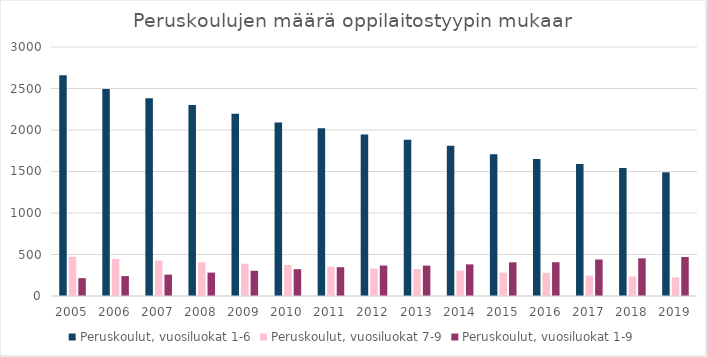
| Category | Peruskoulut, vuosiluokat 1-6 | Peruskoulut, vuosiluokat 7-9 | Peruskoulut, vuosiluokat 1-9 |
|---|---|---|---|
| 2005 | 2660 | 472 | 215 |
| 2006 | 2493 | 447 | 240 |
| 2007 | 2382 | 427 | 258 |
| 2008 | 2300 | 406 | 282 |
| 2009 | 2197 | 388 | 304 |
| 2010 | 2089 | 373 | 323 |
| 2011 | 2020 | 352 | 347 |
| 2012 | 1945 | 331 | 367 |
| 2013 | 1884 | 325 | 366 |
| 2014 | 1811 | 306 | 381 |
| 2015 | 1709 | 281 | 406 |
| 2016 | 1651 | 280 | 407 |
| 2017 | 1589 | 246 | 440 |
| 2018 | 1543 | 236 | 454 |
| 2019 | 1490 | 226 | 470 |